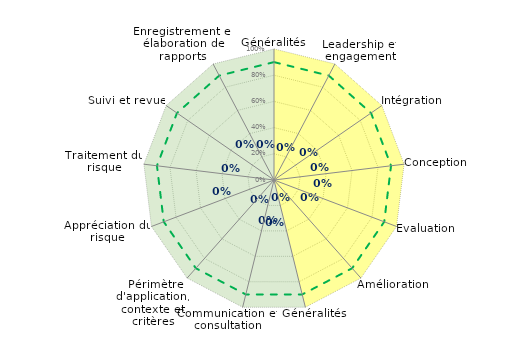
| Category | Couleur Art 4 | Couleur Art 5 | Seuil conformité | Résultats |
|---|---|---|---|---|
| 0 | 1 | 1 | 0.9 | 0 |
| 1 | 1 | 0 | 0.9 | 0 |
| 2 | 1 | 0 | 0.9 | 0 |
| 3 | 1 | 0 | 0.9 | 0 |
| 4 | 1 | 0 | 0.9 | 0 |
| 5 | 1 | 0 | 0.9 | 0 |
| 6 | 1 | 1 | 0.9 | 0 |
| 7 | 0 | 1 | 0.9 | 0 |
| 8 | 0 | 1 | 0.9 | 0 |
| 9 | 0 | 1 | 0.9 | 0 |
| 10 | 0 | 1 | 0.9 | 0 |
| 11 | 0 | 1 | 0.9 | 0 |
| 12 | 0 | 1 | 0.9 | 0 |